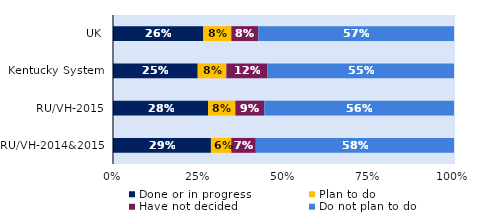
| Category | Done or in progress | Plan to do | Have not decided | Do not plan to do |
|---|---|---|---|---|
| UK | 0.265 | 0.082 | 0.08 | 0.574 |
| Kentucky System | 0.248 | 0.084 | 0.12 | 0.548 |
| RU/VH-2015 | 0.279 | 0.08 | 0.085 | 0.556 |
| RU/VH-2014&2015 | 0.287 | 0.06 | 0.072 | 0.581 |